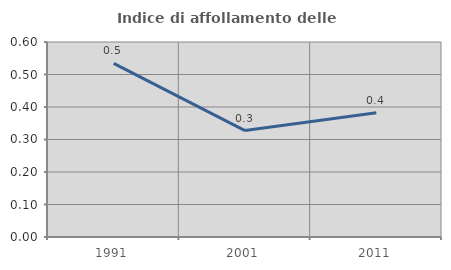
| Category | Indice di affollamento delle abitazioni  |
|---|---|
| 1991.0 | 0.534 |
| 2001.0 | 0.328 |
| 2011.0 | 0.382 |